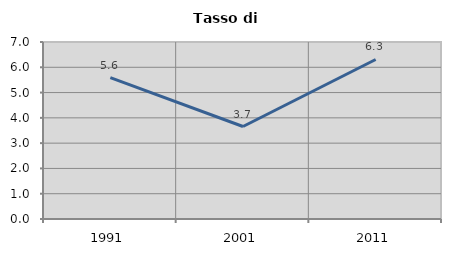
| Category | Tasso di disoccupazione   |
|---|---|
| 1991.0 | 5.594 |
| 2001.0 | 3.657 |
| 2011.0 | 6.308 |